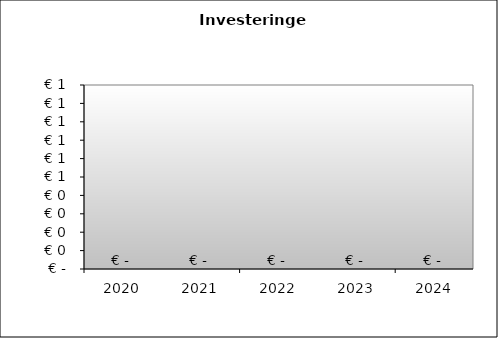
| Category | Series 0 |
|---|---|
| 2020.0 | 0 |
| 2021.0 | 0 |
| 2022.0 | 0 |
| 2023.0 | 0 |
| 2024.0 | 0 |